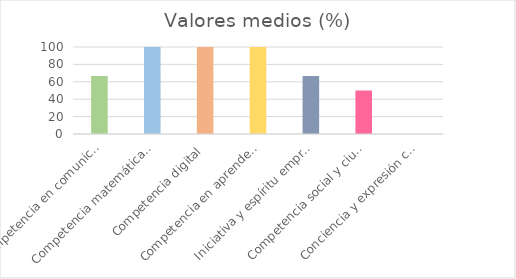
| Category | Valores medios (%) |
|---|---|
| Competencia en comunicación lingüística | 66.667 |
| Competencia matemática, ciencia y tecnología | 100 |
| Competencia digital | 100 |
| Competencia en aprender a aprender | 100 |
| Iniciativa y espíritu emprendedor | 66.667 |
| Competencia social y ciudadana | 50 |
| Conciencia y expresión cultural | 0 |